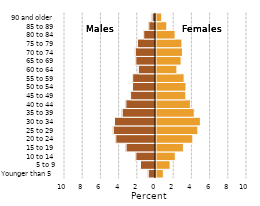
| Category | Female |
|---|---|
| Younger than 5 | 0.805 |
| 5 to 9 | 1.548 |
| 10 to 14 | 2.116 |
| 15 to 19 | 3.013 |
| 20 to 24 | 4.046 |
| 25 to 29 | 4.599 |
| 30 to 34 | 4.88 |
| 35 to 39 | 4.204 |
| 40 to 44 | 3.779 |
| 45 to 49 | 3.273 |
| 50 to 54 | 3.294 |
| 55 to 59 | 3.092 |
| 60 to 64 | 2.298 |
| 65 to 69 | 2.757 |
| 70 to 74 | 2.914 |
| 75 to 79 | 2.847 |
| 80 to 84 | 2.1 |
| 85 to 89 | 1.186 |
| 90 and older | 0.627 |